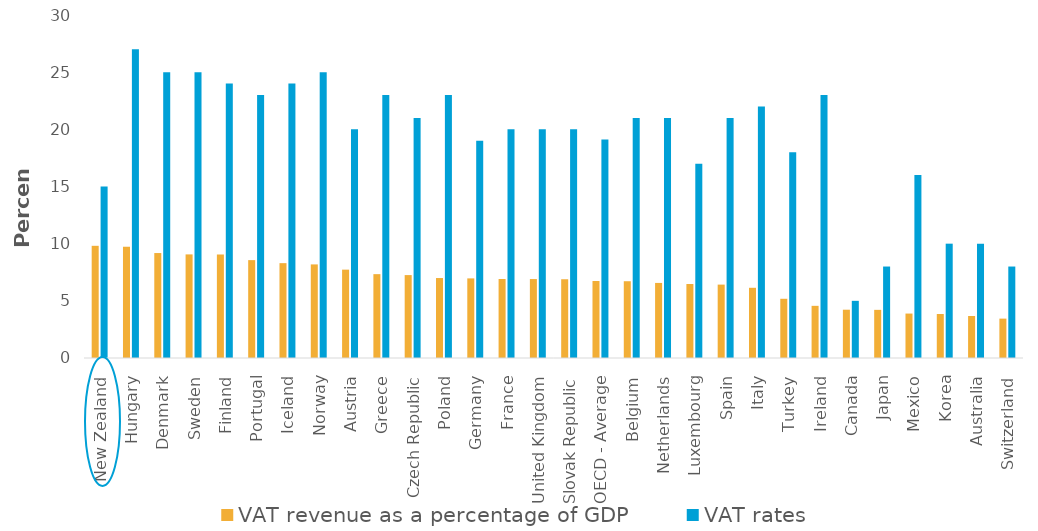
| Category | VAT revenue as a percentage of GDP | VAT rates |
|---|---|---|
| New Zealand | 9.812 | 15 |
| Hungary | 9.728 | 27 |
| Denmark | 9.18 | 25 |
| Sweden | 9.061 | 25 |
| Finland | 9.053 | 24 |
| Portugal | 8.561 | 23 |
| Iceland | 8.296 | 24 |
| Norway | 8.186 | 25 |
| Austria | 7.728 | 20 |
| Greece | 7.334 | 23 |
| Czech Republic | 7.252 | 21 |
| Poland | 6.994 | 23 |
| Germany | 6.963 | 19 |
| France | 6.911 | 20 |
| United Kingdom | 6.904 | 20 |
| Slovak Republic | 6.888 | 20 |
| OECD - Average | 6.733 | 19.103 |
| Belgium | 6.715 | 21 |
| Netherlands | 6.566 | 21 |
| Luxembourg | 6.47 | 17 |
| Spain | 6.419 | 21 |
| Italy | 6.14 | 22 |
| Turkey | 5.179 | 18 |
| Ireland | 4.562 | 23 |
| Canada | 4.224 | 5 |
| Japan | 4.211 | 8 |
| Mexico | 3.887 | 16 |
| Korea | 3.846 | 10 |
| Australia | 3.676 | 10 |
| Switzerland | 3.444 | 8 |